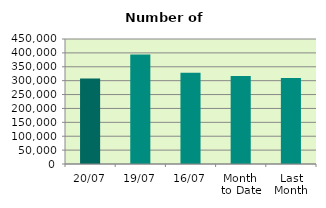
| Category | Series 0 |
|---|---|
| 20/07 | 307586 |
| 19/07 | 394382 |
| 16/07 | 328150 |
| Month 
to Date | 316642.286 |
| Last
Month | 309731.364 |